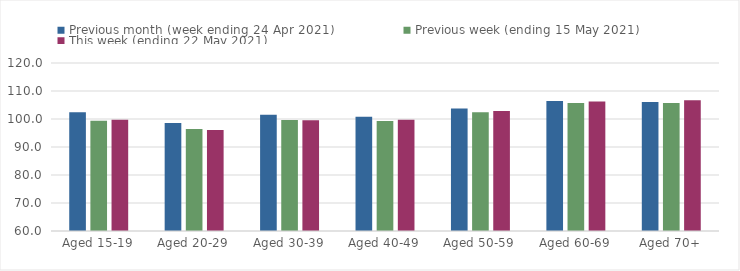
| Category | Previous month (week ending 24 Apr 2021) | Previous week (ending 15 May 2021) | This week (ending 22 May 2021) |
|---|---|---|---|
| Aged 15-19 | 102.42 | 99.39 | 99.72 |
| Aged 20-29 | 98.6 | 96.45 | 96.08 |
| Aged 30-39 | 101.51 | 99.66 | 99.59 |
| Aged 40-49 | 100.8 | 99.27 | 99.71 |
| Aged 50-59 | 103.74 | 102.42 | 102.9 |
| Aged 60-69 | 106.4 | 105.67 | 106.25 |
| Aged 70+ | 106.03 | 105.74 | 106.67 |